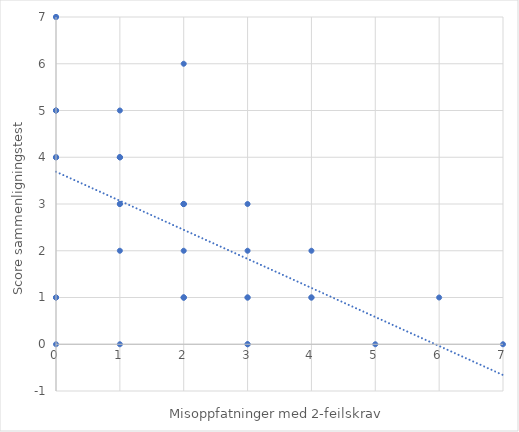
| Category | Series 0 |
|---|---|
| 1.0 | 2 |
| 2.0 | 1 |
| 4.0 | 2 |
| 4.0 | 1 |
| 0.0 | 7 |
| 7.0 | 0 |
| 2.0 | 6 |
| 1.0 | 3 |
| 0.0 | 7 |
| 0.0 | 5 |
| 0.0 | 5 |
| 2.0 | 2 |
| 1.0 | 4 |
| 0.0 | 5 |
| 4.0 | 1 |
| 2.0 | 1 |
| 0.0 | 4 |
| 2.0 | 3 |
| 3.0 | 1 |
| 0.0 | 5 |
| 0.0 | 1 |
| 2.0 | 3 |
| 0.0 | 4 |
| 0.0 | 4 |
| 1.0 | 5 |
| 2.0 | 1 |
| 2.0 | 3 |
| 1.0 | 4 |
| 6.0 | 1 |
| 0.0 | 1 |
| 3.0 | 0 |
| 3.0 | 2 |
| 0.0 | 0 |
| 3.0 | 0 |
| 0.0 | 1 |
| 5.0 | 0 |
| 1.0 | 0 |
| 3.0 | 3 |
| 2.0 | 3 |
| 3.0 | 1 |
| 1.0 | 4 |
| 1.0 | 3 |